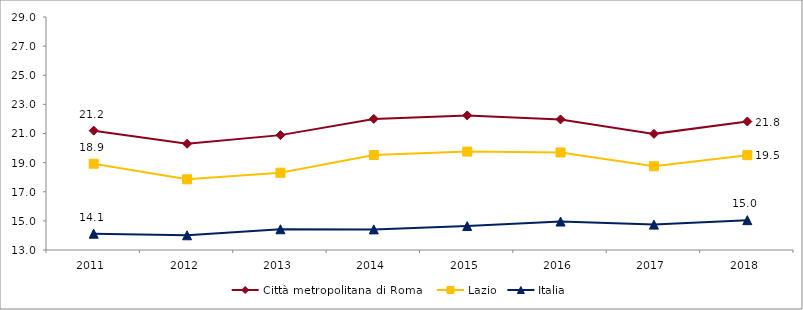
| Category | Città metropolitana di Roma  | Lazio | Italia |
|---|---|---|---|
| 2011.0 | 21.196 | 18.925 | 14.12 |
| 2012.0 | 20.295 | 17.852 | 14.011 |
| 2013.0 | 20.888 | 18.308 | 14.425 |
| 2014.0 | 22 | 19.522 | 14.416 |
| 2015.0 | 22.241 | 19.758 | 14.644 |
| 2016.0 | 21.966 | 19.696 | 14.955 |
| 2017.0 | 20.975 | 18.751 | 14.743 |
| 2018.0 | 21.824 | 19.512 | 15.049 |